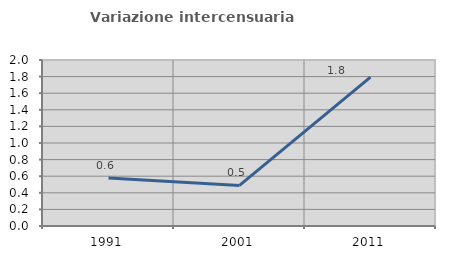
| Category | Variazione intercensuaria annua |
|---|---|
| 1991.0 | 0.579 |
| 2001.0 | 0.489 |
| 2011.0 | 1.793 |